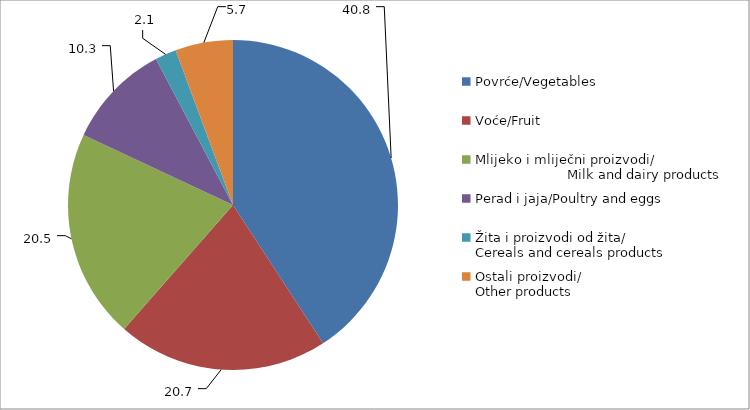
| Category | Series 0 | Series 1 |
|---|---|---|
| Povrće/Vegetables | 40.807 | 452633 |
| Voće/Fruit | 20.66 | 229159 |
| Mlijeko i mliječni proizvodi/                                             Milk and dairy products | 20.507 | 227461 |
| Perad i jaja/Poultry and eggs | 10.288 | 114117 |
| Žita i proizvodi od žita/                           Cereals and cereals products | 2.083 | 23108 |
| Ostali proizvodi/                                      Other products | 5.654 | 62713 |